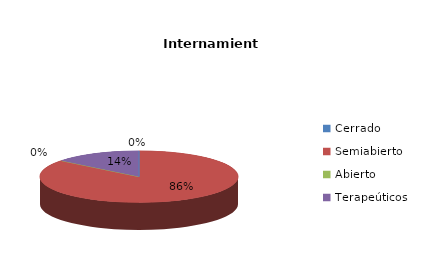
| Category | Series 0 |
|---|---|
| Cerrado | 0 |
| Semiabierto | 12 |
| Abierto | 0 |
| Terapeúticos | 2 |